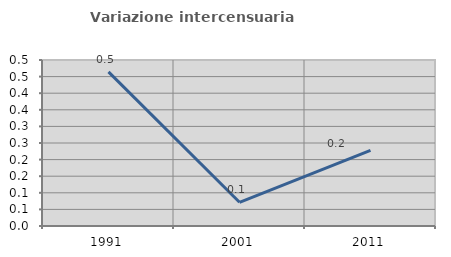
| Category | Variazione intercensuaria annua |
|---|---|
| 1991.0 | 0.464 |
| 2001.0 | 0.071 |
| 2011.0 | 0.228 |